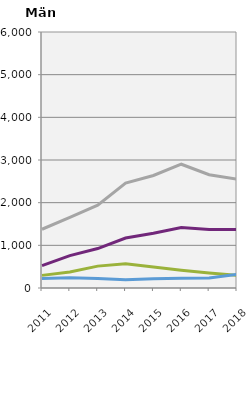
| Category | Ämneslärarexamen                                   | Grundlärarexamen                                   | Förskollärarexamen                                 | Yrkeslärarexamen                                   |
|---|---|---|---|---|
| 2011.0 | 1377 | 524 | 296 | 222 |
| 2012.0 | 1654 | 759 | 377 | 239 |
| 2013.0 | 1940 | 924 | 513 | 225 |
| 2014.0 | 2460 | 1171 | 569 | 196 |
| 2015.0 | 2637 | 1283 | 490 | 216 |
| 2016.0 | 2901 | 1415 | 415 | 231 |
| 2017.0 | 2654 | 1370 | 349 | 235 |
| 2018.0 | 2552 | 1374 | 297 | 322 |